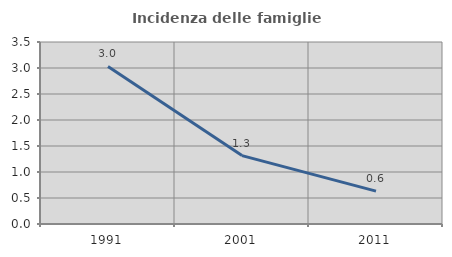
| Category | Incidenza delle famiglie numerose |
|---|---|
| 1991.0 | 3.03 |
| 2001.0 | 1.316 |
| 2011.0 | 0.632 |